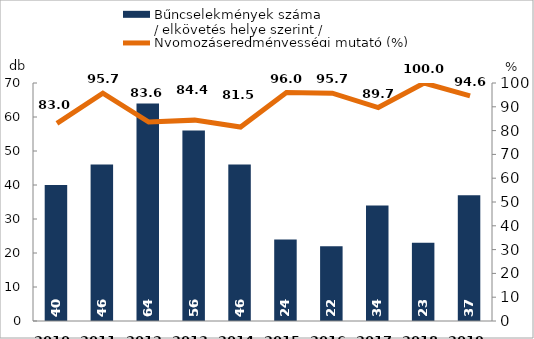
| Category | Bűncselekmények száma
/ elkövetés helye szerint / |
|---|---|
| 2010. év | 40 |
| 2011. év | 46 |
| 2012. év | 64 |
| 2013. év | 56 |
| 2014. év | 46 |
| 2015. év | 24 |
| 2016. év | 22 |
| 2017. év | 34 |
| 2018. év | 23 |
| 2019. év | 37 |